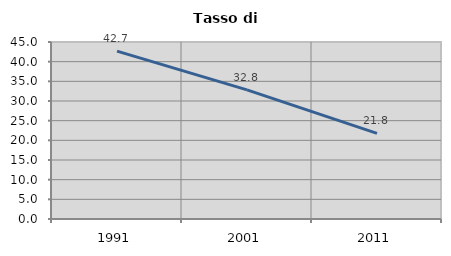
| Category | Tasso di disoccupazione   |
|---|---|
| 1991.0 | 42.683 |
| 2001.0 | 32.824 |
| 2011.0 | 21.766 |